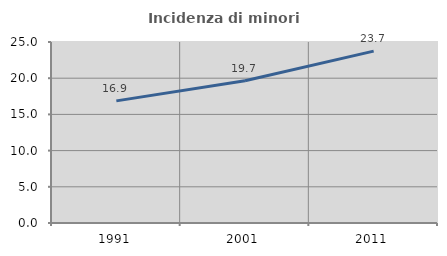
| Category | Incidenza di minori stranieri |
|---|---|
| 1991.0 | 16.867 |
| 2001.0 | 19.656 |
| 2011.0 | 23.741 |